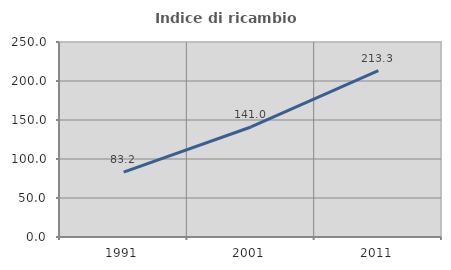
| Category | Indice di ricambio occupazionale  |
|---|---|
| 1991.0 | 83.2 |
| 2001.0 | 141.038 |
| 2011.0 | 213.333 |